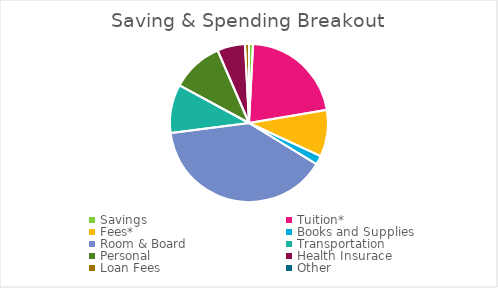
| Category | Series 0 |
|---|---|
| Savings | 500 |
| Tuition* | 13078 |
| Fees* | 5810 |
| Books and Supplies | 1118 |
| Room & Board | 23868 |
| Transportation | 6044 |
| Personal | 6440 |
| Health Insurace | 3450 |
| Loan Fees | 498 |
| Other | 0 |